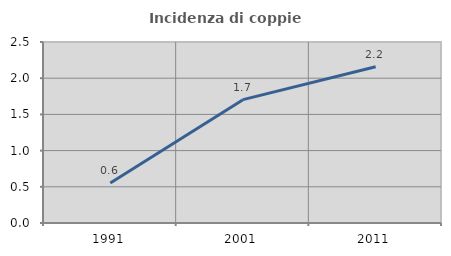
| Category | Incidenza di coppie miste |
|---|---|
| 1991.0 | 0.551 |
| 2001.0 | 1.703 |
| 2011.0 | 2.158 |